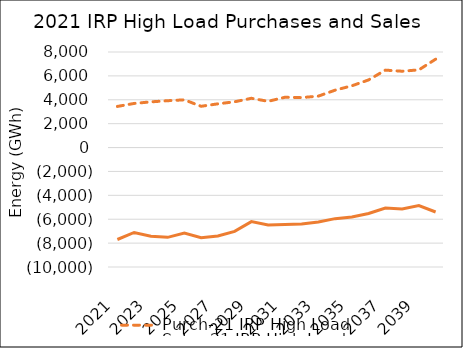
| Category | Purch-21 IRP High Load | Sales-21 IRP High Load |
|---|---|---|
| 2021.0 | 3442.34 | -7697.56 |
| 2022.0 | 3693.7 | -7108.53 |
| 2023.0 | 3825.01 | -7417.85 |
| 2024.0 | 3922.13 | -7516.11 |
| 2025.0 | 3994.79 | -7161.69 |
| 2026.0 | 3454.61 | -7545.65 |
| 2027.0 | 3660.66 | -7410.05 |
| 2028.0 | 3832.24 | -7015.63 |
| 2029.0 | 4124.31 | -6199.93 |
| 2030.0 | 3872.03 | -6475.51 |
| 2031.0 | 4207.96 | -6440.62 |
| 2032.0 | 4183.84 | -6405.69 |
| 2033.0 | 4305.84 | -6223.98 |
| 2034.0 | 4804.92 | -5951.32 |
| 2035.0 | 5171.13 | -5815.78 |
| 2036.0 | 5662.99 | -5521.17 |
| 2037.0 | 6481.91 | -5059.61 |
| 2038.0 | 6390.51 | -5144.77 |
| 2039.0 | 6504.74 | -4860.14 |
| 2040.0 | 7397.97 | -5394.57 |